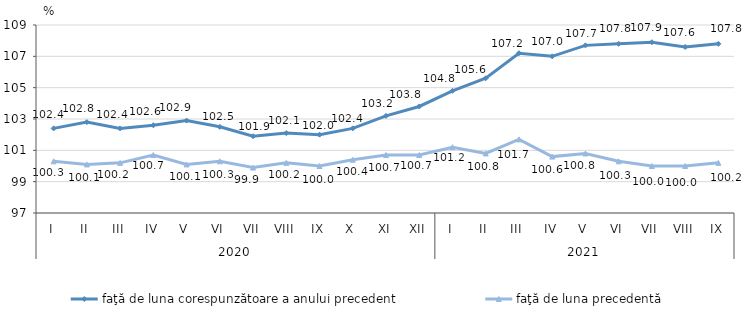
| Category | faţă de luna corespunzătoare a anului precedent | faţă de luna precedentă   |
|---|---|---|
| 0 | 102.4 | 100.3 |
| 1 | 102.8 | 100.1 |
| 2 | 102.4 | 100.2 |
| 3 | 102.6 | 100.7 |
| 4 | 102.9 | 100.1 |
| 5 | 102.5 | 100.3 |
| 6 | 101.9 | 99.9 |
| 7 | 102.1 | 100.2 |
| 8 | 102 | 100 |
| 9 | 102.4 | 100.4 |
| 10 | 103.2 | 100.7 |
| 11 | 103.8 | 100.7 |
| 12 | 104.8 | 101.2 |
| 13 | 105.6 | 100.8 |
| 14 | 107.2 | 101.7 |
| 15 | 107 | 100.6 |
| 16 | 107.7 | 100.8 |
| 17 | 107.8 | 100.3 |
| 18 | 107.9 | 100 |
| 19 | 107.6 | 100 |
| 20 | 107.8 | 100.2 |